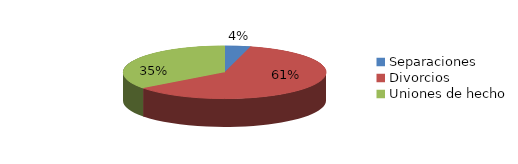
| Category | Series 0 |
|---|---|
| Separaciones | 55 |
| Divorcios | 817 |
| Uniones de hecho | 475 |